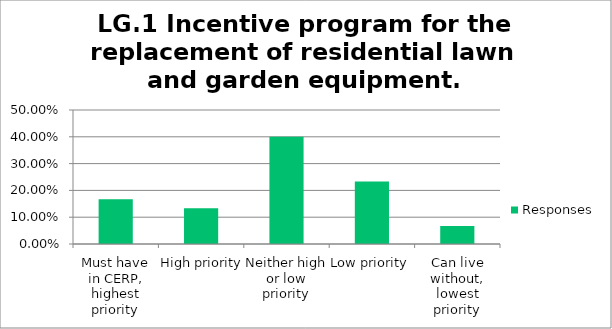
| Category | Responses |
|---|---|
| Must have in CERP, highest priority | 0.167 |
| High priority | 0.133 |
| Neither high or low priority | 0.4 |
| Low priority | 0.233 |
| Can live without, lowest priority | 0.067 |